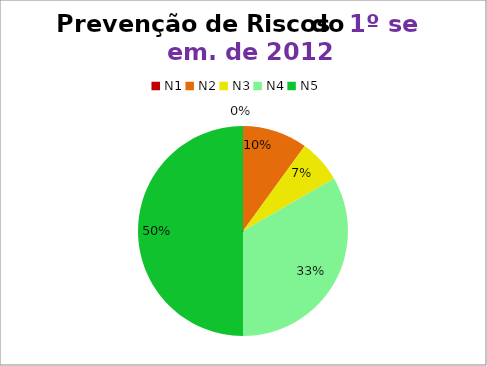
| Category | 1º/12 |
|---|---|
| N1 | 0 |
| N2 | 3 |
| N3 | 2 |
| N4 | 10 |
| N5 | 15 |